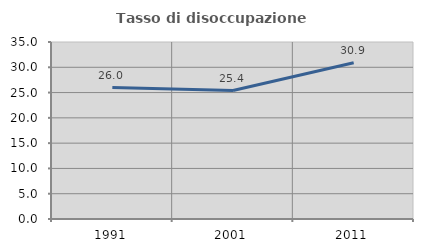
| Category | Tasso di disoccupazione giovanile  |
|---|---|
| 1991.0 | 26 |
| 2001.0 | 25.397 |
| 2011.0 | 30.909 |